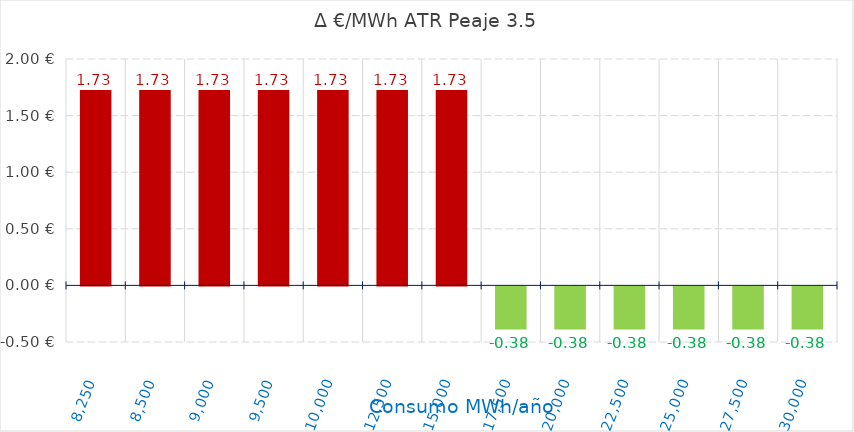
| Category | D €/MWh |
|---|---|
| 8250.0 | 1.726 |
| 8500.0 | 1.726 |
| 9000.0 | 1.726 |
| 9500.0 | 1.726 |
| 10000.0 | 1.726 |
| 12500.0 | 1.726 |
| 15000.0 | 1.726 |
| 17500.0 | -0.38 |
| 20000.0 | -0.38 |
| 22500.0 | -0.38 |
| 25000.0 | -0.38 |
| 27500.0 | -0.38 |
| 30000.0 | -0.38 |